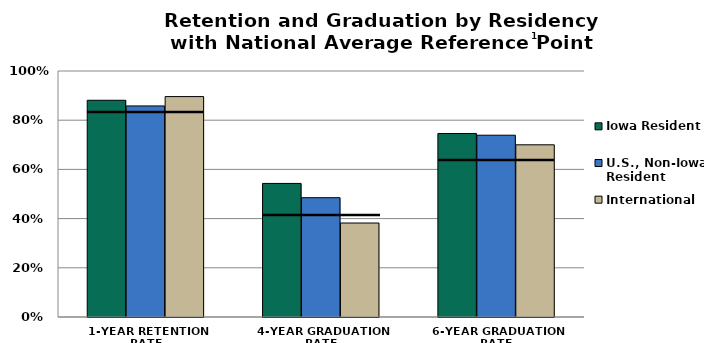
| Category | Iowa Resident | U.S., Non-Iowa Resident | International |
|---|---|---|---|
| 1-YEAR RETENTION RATE | 0.881 | 0.858 | 0.896 |
| 4-YEAR GRADUATION RATE | 0.543 | 0.485 | 0.382 |
| 6-YEAR GRADUATION RATE | 0.746 | 0.739 | 0.7 |